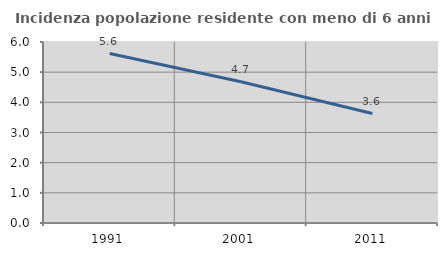
| Category | Incidenza popolazione residente con meno di 6 anni |
|---|---|
| 1991.0 | 5.618 |
| 2001.0 | 4.68 |
| 2011.0 | 3.63 |